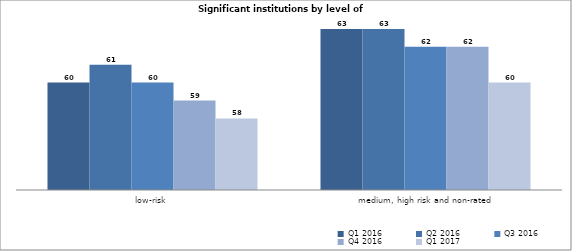
| Category | Q1 2016 | Q2 2016 | Q3 2016 | Q4 2016 | Q1 2017 |
|---|---|---|---|---|---|
| low-risk | 60 | 61 | 60 | 59 | 58 |
| medium, high risk and non-rated | 63 | 63 | 62 | 62 | 60 |